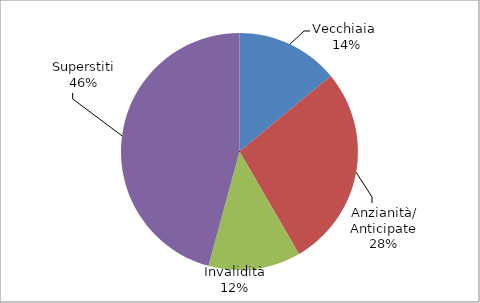
| Category | Series 0 |
|---|---|
| Vecchiaia  | 23991 |
| Anzianità/ Anticipate | 47416 |
| Invalidità | 21603 |
| Superstiti | 78541 |